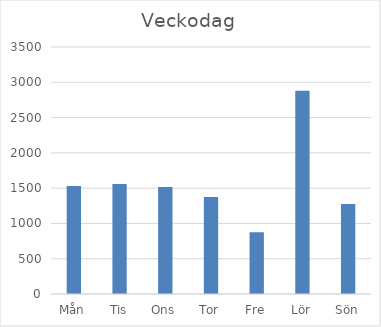
| Category | Summa |
|---|---|
| Mån | 1531 |
| Tis | 1559 |
| Ons | 1516 |
| Tor | 1375 |
| Fre | 875 |
| Lör | 2881 |
| Sön | 1275 |